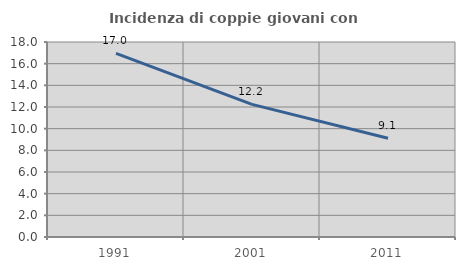
| Category | Incidenza di coppie giovani con figli |
|---|---|
| 1991.0 | 16.951 |
| 2001.0 | 12.245 |
| 2011.0 | 9.115 |